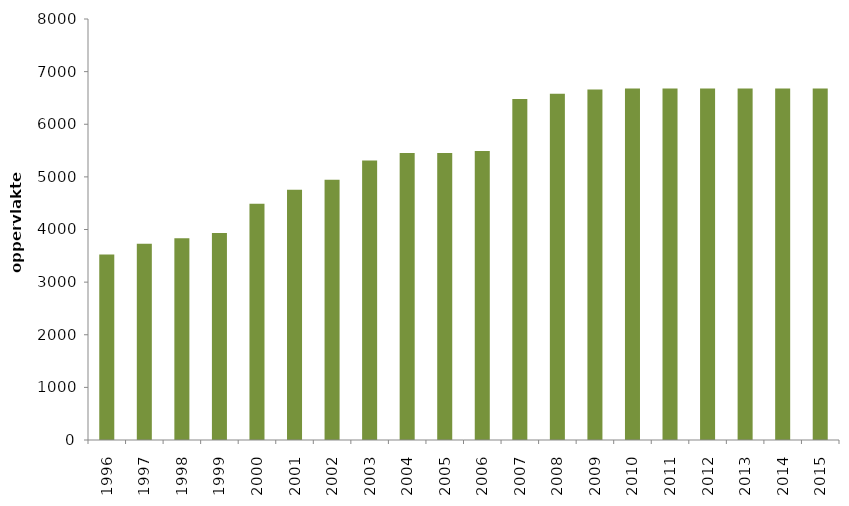
| Category | Series 1 |
|---|---|
| 1996.0 | 3524 |
| 1997.0 | 3730 |
| 1998.0 | 3833 |
| 1999.0 | 3935 |
| 2000.0 | 4490 |
| 2001.0 | 4755 |
| 2002.0 | 4947 |
| 2003.0 | 5312 |
| 2004.0 | 5453 |
| 2005.0 | 5455 |
| 2006.0 | 5491 |
| 2007.0 | 6478 |
| 2008.0 | 6579.186 |
| 2009.0 | 6658 |
| 2010.0 | 6680 |
| 2011.0 | 6680 |
| 2012.0 | 6680 |
| 2013.0 | 6680 |
| 2014.0 | 6680 |
| 2015.0 | 6680 |